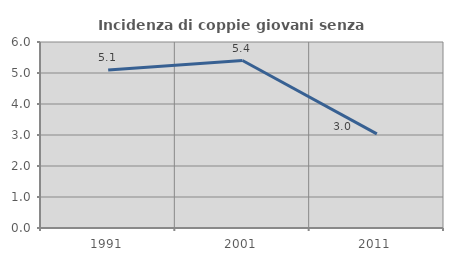
| Category | Incidenza di coppie giovani senza figli |
|---|---|
| 1991.0 | 5.096 |
| 2001.0 | 5.402 |
| 2011.0 | 3.038 |